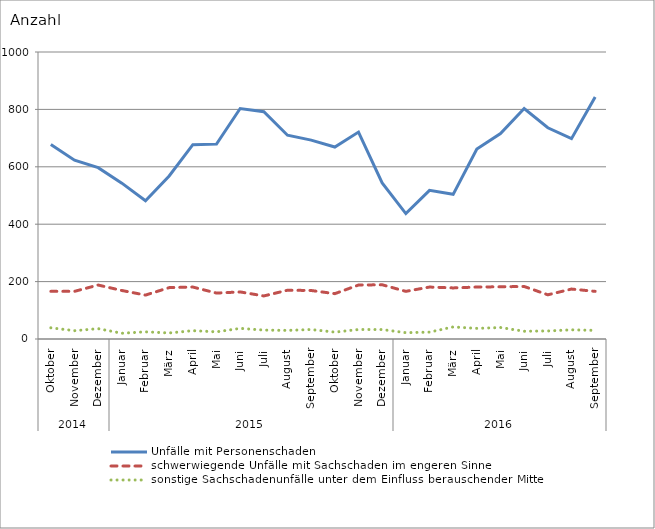
| Category | Unfälle mit Personenschaden | schwerwiegende Unfälle mit Sachschaden im engeren Sinne | sonstige Sachschadenunfälle unter dem Einfluss berauschender Mittel |
|---|---|---|---|
| 0 | 678 | 166 | 39 |
| 1 | 623 | 166 | 29 |
| 2 | 597 | 188 | 36 |
| 3 | 543 | 169 | 20 |
| 4 | 482 | 153 | 25 |
| 5 | 568 | 179 | 21 |
| 6 | 677 | 181 | 29 |
| 7 | 679 | 160 | 25 |
| 8 | 803 | 164 | 37 |
| 9 | 792 | 150 | 31 |
| 10 | 710 | 170 | 30 |
| 11 | 693 | 169 | 33 |
| 12 | 669 | 158 | 24 |
| 13 | 721 | 188 | 33 |
| 14 | 544 | 189 | 33 |
| 15 | 437 | 166 | 22 |
| 16 | 518 | 181 | 24 |
| 17 | 504 | 178 | 42 |
| 18 | 662 | 181 | 37 |
| 19 | 716 | 182 | 40 |
| 20 | 803 | 183 | 27 |
| 21 | 736 | 154 | 28 |
| 22 | 698 | 174 | 32 |
| 23 | 843 | 166 | 30 |